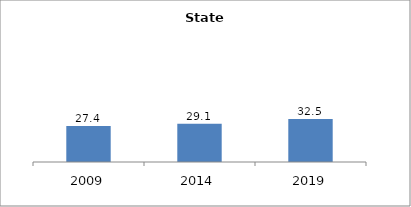
| Category | Series 0 |
|---|---|
| 2009.0 | 27.362 |
| 2014.0 | 29.052 |
| 2019.0 | 32.507 |